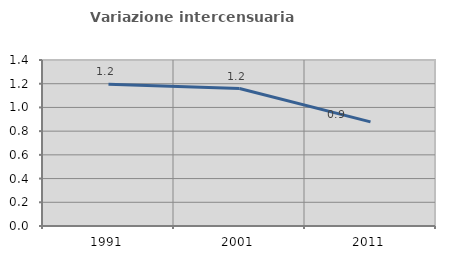
| Category | Variazione intercensuaria annua |
|---|---|
| 1991.0 | 1.195 |
| 2001.0 | 1.159 |
| 2011.0 | 0.878 |